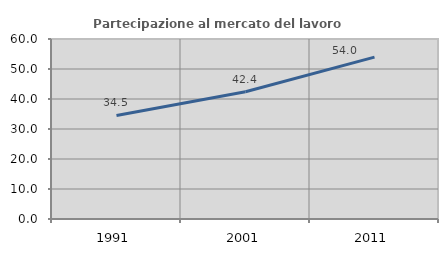
| Category | Partecipazione al mercato del lavoro  femminile |
|---|---|
| 1991.0 | 34.512 |
| 2001.0 | 42.407 |
| 2011.0 | 53.966 |